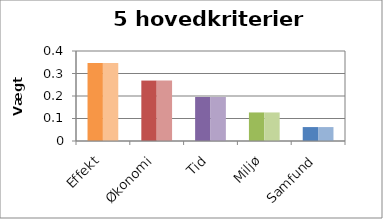
| Category | Vægt 1 | Vægt 2 |
|---|---|---|
| Effekt | 0.347 | 0.347 |
| Økonomi | 0.269 | 0.269 |
| Tid | 0.196 | 0.196 |
| Miljø | 0.127 | 0.127 |
| Samfund | 0.062 | 0.062 |